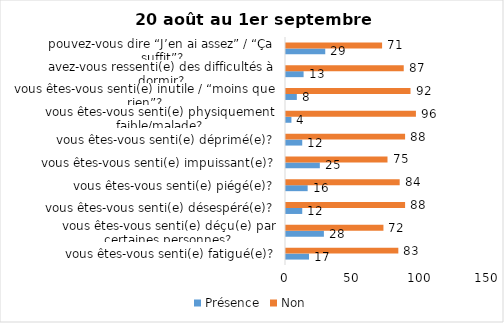
| Category | Présence | Non |
|---|---|---|
| vous êtes-vous senti(e) fatigué(e)? | 17 | 83 |
| vous êtes-vous senti(e) déçu(e) par certaines personnes? | 28 | 72 |
| vous êtes-vous senti(e) désespéré(e)? | 12 | 88 |
| vous êtes-vous senti(e) piégé(e)? | 16 | 84 |
| vous êtes-vous senti(e) impuissant(e)? | 25 | 75 |
| vous êtes-vous senti(e) déprimé(e)? | 12 | 88 |
| vous êtes-vous senti(e) physiquement faible/malade? | 4 | 96 |
| vous êtes-vous senti(e) inutile / “moins que rien”? | 8 | 92 |
| avez-vous ressenti(e) des difficultés à dormir? | 13 | 87 |
| pouvez-vous dire “J’en ai assez” / “Ça suffit”? | 29 | 71 |